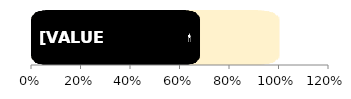
| Category | Total | Men |
|---|---|---|
| 0 | 1 | 0.679 |